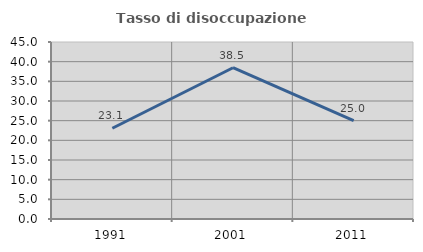
| Category | Tasso di disoccupazione giovanile  |
|---|---|
| 1991.0 | 23.077 |
| 2001.0 | 38.462 |
| 2011.0 | 25 |